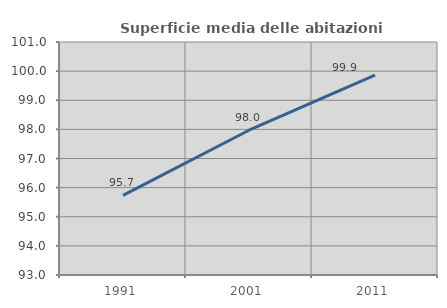
| Category | Superficie media delle abitazioni occupate |
|---|---|
| 1991.0 | 95.736 |
| 2001.0 | 97.97 |
| 2011.0 | 99.866 |